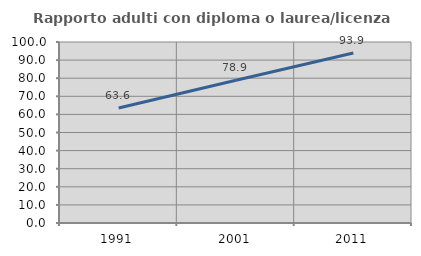
| Category | Rapporto adulti con diploma o laurea/licenza media  |
|---|---|
| 1991.0 | 63.581 |
| 2001.0 | 78.894 |
| 2011.0 | 93.902 |